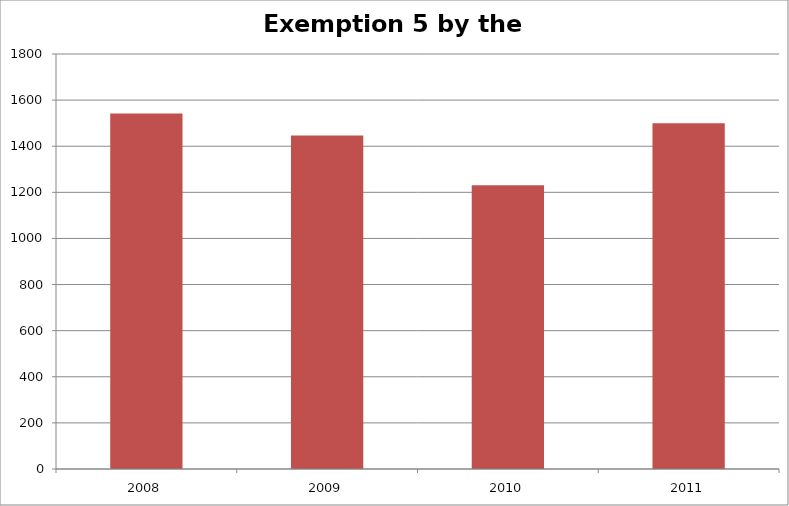
| Category | Exemption 5 by the Numbers |
|---|---|
| 0 | 1542 |
| 1 | 1447 |
| 2 | 1231 |
| 3 | 1500 |